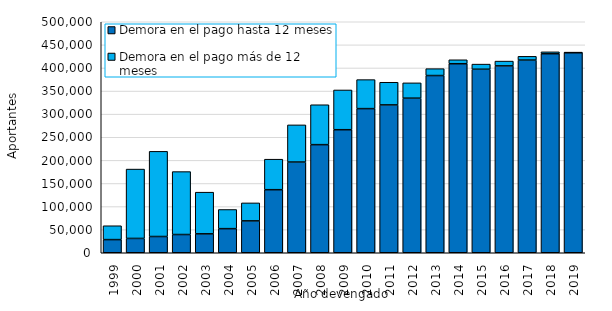
| Category | Demora en el pago hasta 12 meses | Demora en el pago más de 12 meses |
|---|---|---|
| 1999.0 | 28465 | 29982 |
| 2000.0 | 31003 | 150129 |
| 2001.0 | 35168 | 184345 |
| 2002.0 | 39441 | 136226 |
| 2003.0 | 40990 | 90134 |
| 2004.0 | 52176 | 41463 |
| 2005.0 | 69015 | 38902 |
| 2006.0 | 136495 | 66036 |
| 2007.0 | 196342 | 80439 |
| 2008.0 | 234000 | 86376 |
| 2009.0 | 266330 | 86026 |
| 2010.0 | 311990 | 62776 |
| 2011.0 | 320041 | 49029 |
| 2012.0 | 334618 | 33144 |
| 2013.0 | 383568 | 14875 |
| 2014.0 | 409141 | 8554 |
| 2015.0 | 397246 | 11082 |
| 2016.0 | 404470 | 10390 |
| 2017.0 | 417051 | 8105 |
| 2018.0 | 430812 | 4066 |
| 2019.0 | 433197 | 338 |